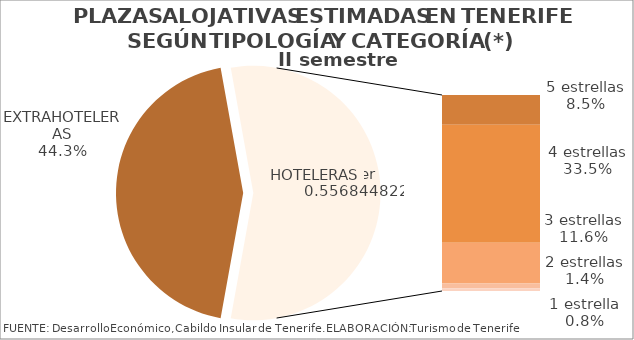
| Category | II semestre 2014 |
|---|---|
| EXTRAHOTELERAS | 0.443 |
| 5 estrellas | 0.085 |
| 4 estrellas | 0.335 |
| 3 estrellas | 0.116 |
| 2 estrellas | 0.014 |
| 1 estrella | 0.008 |